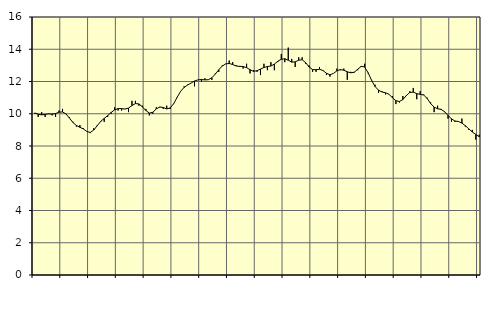
| Category | Piggar | Series 1 |
|---|---|---|
| nan | 10 | 10.05 |
| 87.0 | 9.8 | 9.97 |
| 87.0 | 10.1 | 9.93 |
| 87.0 | 9.8 | 9.96 |
| nan | 10 | 9.99 |
| 88.0 | 9.9 | 9.98 |
| 88.0 | 9.8 | 10.01 |
| 88.0 | 10.2 | 10.1 |
| nan | 10.3 | 10.11 |
| 89.0 | 10 | 9.99 |
| 89.0 | 9.8 | 9.73 |
| 89.0 | 9.5 | 9.46 |
| nan | 9.2 | 9.27 |
| 90.0 | 9.3 | 9.16 |
| 90.0 | 9.1 | 9.06 |
| 90.0 | 8.9 | 8.9 |
| nan | 8.8 | 8.84 |
| 91.0 | 9.1 | 8.99 |
| 91.0 | 9.3 | 9.26 |
| 91.0 | 9.5 | 9.53 |
| nan | 9.5 | 9.71 |
| 92.0 | 9.8 | 9.88 |
| 92.0 | 10 | 10.08 |
| 92.0 | 10.4 | 10.24 |
| nan | 10.2 | 10.32 |
| 93.0 | 10.2 | 10.32 |
| 93.0 | 10.3 | 10.29 |
| 93.0 | 10.1 | 10.35 |
| nan | 10.8 | 10.51 |
| 94.0 | 10.8 | 10.63 |
| 94.0 | 10.5 | 10.61 |
| 94.0 | 10.5 | 10.43 |
| nan | 10.3 | 10.2 |
| 95.0 | 9.9 | 10.04 |
| 95.0 | 10 | 10.09 |
| 95.0 | 10.4 | 10.3 |
| nan | 10.4 | 10.42 |
| 96.0 | 10.3 | 10.39 |
| 96.0 | 10.5 | 10.3 |
| 96.0 | 10.3 | 10.36 |
| nan | 10.6 | 10.62 |
| 97.0 | 11 | 11.02 |
| 97.0 | 11.4 | 11.39 |
| 97.0 | 11.7 | 11.63 |
| nan | 11.8 | 11.78 |
| 98.0 | 11.9 | 11.9 |
| 98.0 | 11.7 | 12.03 |
| 98.0 | 12.1 | 12.1 |
| nan | 12 | 12.12 |
| 99.0 | 12.2 | 12.1 |
| 99.0 | 12.1 | 12.11 |
| 99.0 | 12.1 | 12.23 |
| nan | 12.5 | 12.46 |
| 0.0 | 12.6 | 12.73 |
| 0.0 | 13 | 12.96 |
| 0.0 | 13.1 | 13.09 |
| nan | 13.3 | 13.12 |
| 1.0 | 13.2 | 13.05 |
| 1.0 | 13 | 12.96 |
| 1.0 | 12.9 | 12.94 |
| nan | 12.8 | 12.93 |
| 2.0 | 13.1 | 12.86 |
| 2.0 | 12.5 | 12.73 |
| 2.0 | 12.7 | 12.63 |
| nan | 12.6 | 12.67 |
| 3.0 | 12.4 | 12.77 |
| 3.0 | 13.1 | 12.87 |
| 3.0 | 12.7 | 12.93 |
| nan | 13.2 | 12.96 |
| 4.0 | 12.7 | 13.08 |
| 4.0 | 13.2 | 13.26 |
| 4.0 | 13.7 | 13.38 |
| nan | 13.2 | 13.41 |
| 5.0 | 14.1 | 13.32 |
| 5.0 | 13.4 | 13.2 |
| 5.0 | 12.9 | 13.22 |
| nan | 13.5 | 13.32 |
| 6.0 | 13.5 | 13.35 |
| 6.0 | 13.1 | 13.17 |
| 6.0 | 13 | 12.9 |
| nan | 12.6 | 12.74 |
| 7.0 | 12.6 | 12.73 |
| 7.0 | 12.9 | 12.76 |
| 7.0 | 12.7 | 12.68 |
| nan | 12.4 | 12.51 |
| 8.0 | 12.3 | 12.42 |
| 8.0 | 12.5 | 12.5 |
| 8.0 | 12.8 | 12.66 |
| nan | 12.7 | 12.74 |
| 9.0 | 12.8 | 12.7 |
| 9.0 | 12.1 | 12.6 |
| 9.0 | 12.6 | 12.54 |
| nan | 12.6 | 12.57 |
| 10.0 | 12.7 | 12.76 |
| 10.0 | 12.9 | 12.94 |
| 10.0 | 13.1 | 12.9 |
| nan | 12.5 | 12.54 |
| 11.0 | 12.1 | 12.07 |
| 11.0 | 11.8 | 11.69 |
| 11.0 | 11.3 | 11.46 |
| nan | 11.4 | 11.35 |
| 12.0 | 11.2 | 11.3 |
| 12.0 | 11.2 | 11.21 |
| 12.0 | 11.1 | 10.99 |
| nan | 10.6 | 10.81 |
| 13.0 | 10.7 | 10.76 |
| 13.0 | 11.1 | 10.88 |
| 13.0 | 11.1 | 11.13 |
| nan | 11.4 | 11.32 |
| 14.0 | 11.6 | 11.34 |
| 14.0 | 10.9 | 11.25 |
| 14.0 | 11.4 | 11.2 |
| nan | 11.2 | 11.16 |
| 15.0 | 11 | 10.95 |
| 15.0 | 10.7 | 10.63 |
| 15.0 | 10.1 | 10.41 |
| nan | 10.5 | 10.31 |
| 16.0 | 10.3 | 10.27 |
| 16.0 | 10.1 | 10.13 |
| 16.0 | 9.7 | 9.9 |
| nan | 9.5 | 9.68 |
| 17.0 | 9.5 | 9.55 |
| 17.0 | 9.5 | 9.52 |
| 17.0 | 9.7 | 9.42 |
| nan | 9.2 | 9.26 |
| 18.0 | 9 | 9.06 |
| 18.0 | 9 | 8.87 |
| 18.0 | 8.4 | 8.72 |
| nan | 8.7 | 8.57 |